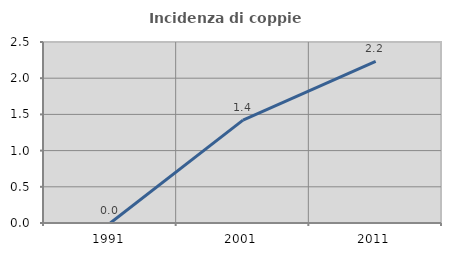
| Category | Incidenza di coppie miste |
|---|---|
| 1991.0 | 0 |
| 2001.0 | 1.422 |
| 2011.0 | 2.232 |